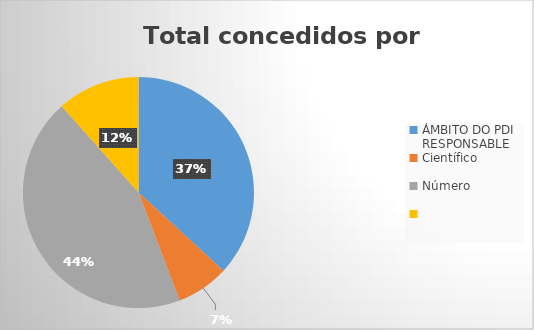
| Category | Total xeral |
|---|---|
| 0 | 35 |
| 1 | 7 |
| 2 | 42 |
| 3 | 11 |